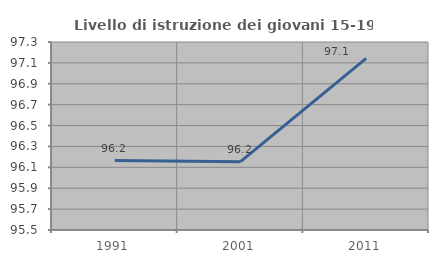
| Category | Livello di istruzione dei giovani 15-19 anni |
|---|---|
| 1991.0 | 96.165 |
| 2001.0 | 96.154 |
| 2011.0 | 97.143 |